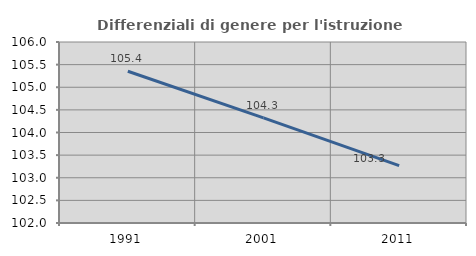
| Category | Differenziali di genere per l'istruzione superiore |
|---|---|
| 1991.0 | 105.354 |
| 2001.0 | 104.325 |
| 2011.0 | 103.267 |